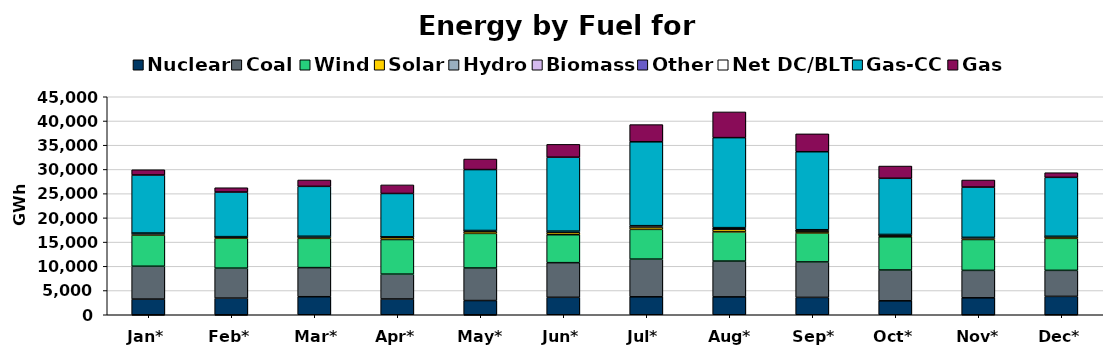
| Category | Nuclear | Coal | Wind | Solar | Hydro | Biomass | Other | Net DC/BLT | Gas-CC | Gas |
|---|---|---|---|---|---|---|---|---|---|---|
| Jan* | 3230 | 6784 | 6436 | 239 | 145 | 35 | 2 | -102 | 11978 | 1083 |
| Feb* | 3431 | 6188 | 6173 | 227 | 72 | 31 | 2 | -119 | 9206 | 889 |
| Mar* | 3723 | 6005 | 6045 | 289 | 73 | 47 | 1 | 21 | 10300 | 1317 |
| Apr* | 3252 | 5132 | 7148 | 410 | 114 | 28 | 2 | 1 | 8948 | 1770 |
| May* | 2934 | 6718 | 7145 | 377 | 191 | 31 | 1 | -102 | 12571 | 2177 |
| Jun* | 3601 | 7152 | 5765 | 447 | 124 | 29 | 2 | 141 | 15262 | 2647 |
| Jul* | 3705 | 7776 | 6146 | 511 | 63 | 34 | 4 | 148 | 17314 | 3545 |
| Aug* | 3691 | 7386 | 6029 | 505 | 55 | 75 | 7 | 232 | 18580 | 5311 |
| Sep* | 3582 | 7321 | 5983 | 403 | 41 | 34 | 3 | 184 | 16100 | 3686 |
| Oct* | 2877 | 6359 | 6854 | 367 | 25 | 27 | 1 | 68 | 11590 | 2529 |
| Nov* | 3498 | 5662 | 6375 | 284 | 22 | 25 | -1 | 112 | 10375 | 1464 |
| Dec* | 3790 | 5375 | 6608 | 340 | 31 | 26 | -1 | 28 | 12165 | 961 |